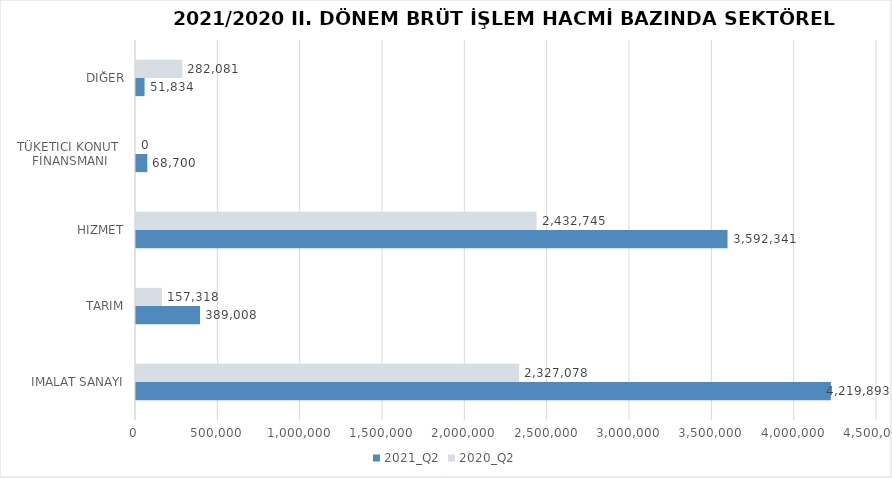
| Category | 2021_Q2 | 2020_Q2 |
|---|---|---|
| İMALAT SANAYİ | 4219892.617 | 2327078.197 |
| TARIM | 389008.254 | 157318.45 |
| HİZMET | 3592341.253 | 2432744.562 |
| TÜKETİCİ KONUT 
FİNANSMANI | 68700 | 0 |
| DİĞER | 51834 | 282081.38 |